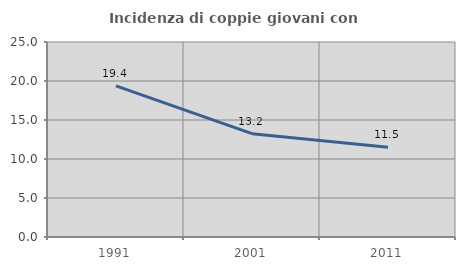
| Category | Incidenza di coppie giovani con figli |
|---|---|
| 1991.0 | 19.368 |
| 2001.0 | 13.247 |
| 2011.0 | 11.517 |